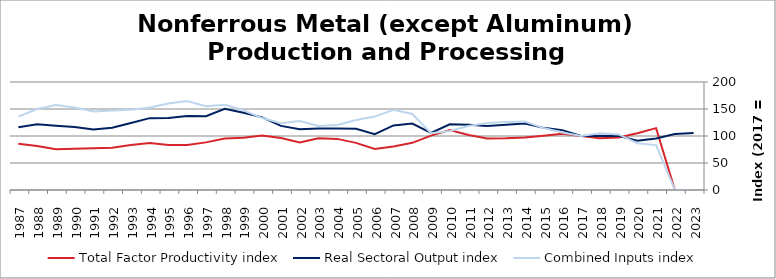
| Category | Total Factor Productivity index | Real Sectoral Output index | Combined Inputs index |
|---|---|---|---|
| 2023.0 | 0 | 105.389 | 0 |
| 2022.0 | 0 | 103.644 | 0 |
| 2021.0 | 114.583 | 95.268 | 83.143 |
| 2020.0 | 105.143 | 91.176 | 86.716 |
| 2019.0 | 97.443 | 100.214 | 102.844 |
| 2018.0 | 95.71 | 100.59 | 105.1 |
| 2017.0 | 100 | 100 | 100 |
| 2016.0 | 104.025 | 110.881 | 106.591 |
| 2015.0 | 100.338 | 115.067 | 114.68 |
| 2014.0 | 97.166 | 123.261 | 126.857 |
| 2013.0 | 95.699 | 120.609 | 126.029 |
| 2012.0 | 95.45 | 118.388 | 124.031 |
| 2011.0 | 101.876 | 120.614 | 118.393 |
| 2010.0 | 111.225 | 121.587 | 109.317 |
| 2009.0 | 100.753 | 105.765 | 104.975 |
| 2008.0 | 87.391 | 123.037 | 140.788 |
| 2007.0 | 80.432 | 119.582 | 148.675 |
| 2006.0 | 76.012 | 103.323 | 135.93 |
| 2005.0 | 87.319 | 113.253 | 129.701 |
| 2004.0 | 94.647 | 113.936 | 120.38 |
| 2003.0 | 95.919 | 113.849 | 118.693 |
| 2002.0 | 88.086 | 112.422 | 127.628 |
| 2001.0 | 96.193 | 118.772 | 123.473 |
| 2000.0 | 100.958 | 134.468 | 133.191 |
| 1999.0 | 96.829 | 143.011 | 147.694 |
| 1998.0 | 95.393 | 150.498 | 157.766 |
| 1997.0 | 88.188 | 136.7 | 155.009 |
| 1996.0 | 83.294 | 137.187 | 164.703 |
| 1995.0 | 83.298 | 133.508 | 160.277 |
| 1994.0 | 87.066 | 133.043 | 152.807 |
| 1993.0 | 83.5 | 123.952 | 148.445 |
| 1992.0 | 78.424 | 115.419 | 147.173 |
| 1991.0 | 77.277 | 112.208 | 145.202 |
| 1990.0 | 76.416 | 116.864 | 152.93 |
| 1989.0 | 75.655 | 119.132 | 157.467 |
| 1988.0 | 81.352 | 121.935 | 149.885 |
| 1987.0 | 85.617 | 116.317 | 135.858 |